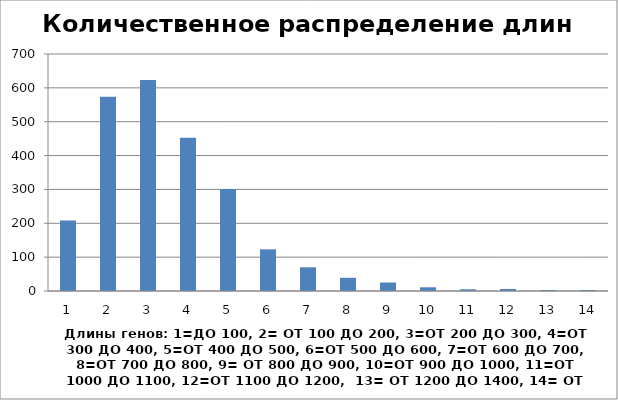
| Category | Series 0 |
|---|---|
| 0 | 208 |
| 1 | 574 |
| 2 | 623 |
| 3 | 453 |
| 4 | 301 |
| 5 | 123 |
| 6 | 70 |
| 7 | 39 |
| 8 | 25 |
| 9 | 11 |
| 10 | 5 |
| 11 | 6 |
| 12 | 3 |
| 13 | 3 |